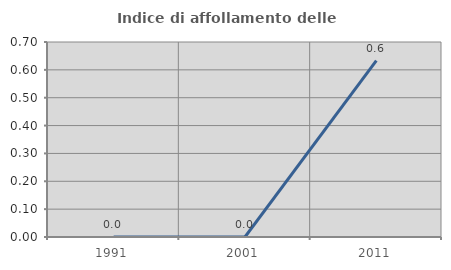
| Category | Indice di affollamento delle abitazioni  |
|---|---|
| 1991.0 | 0 |
| 2001.0 | 0 |
| 2011.0 | 0.633 |